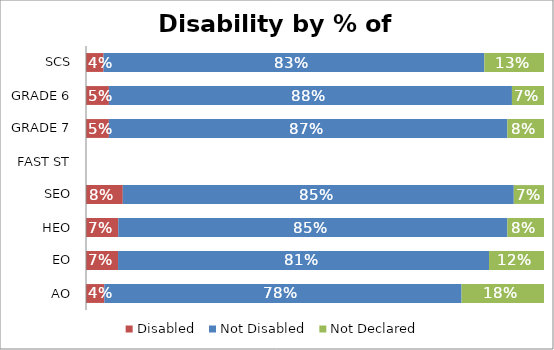
| Category | Disabled | Not Disabled | Not Declared |
|---|---|---|---|
| AO | 0.04 | 0.78 | 0.18 |
| EO | 0.07 | 0.81 | 0.12 |
| HEO | 0.071 | 0.85 | 0.08 |
| SEO | 0.08 | 0.85 | 0.066 |
| FAST ST | 0 | 0 | 0 |
| GRADE 7 | 0.05 | 0.87 | 0.08 |
| GRADE 6 | 0.05 | 0.88 | 0.07 |
| SCS | 0.038 | 0.83 | 0.13 |